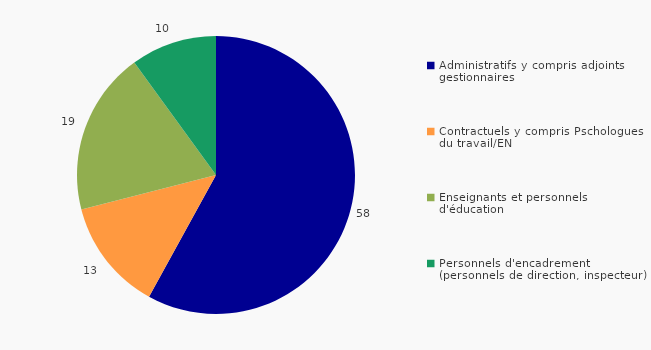
| Category | Taux de conseillers RH de proximité (%) |
|---|---|
| Administratifs y compris adjoints gestionnaires | 58 |
| Contractuels y compris Pschologues du travail/EN | 13 |
| Enseignants et personnels d'éducation | 19 |
| Personnels d'encadrement (personnels de direction, inspecteur) | 10 |